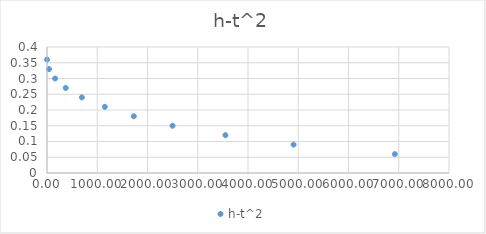
| Category | h-t^2 |
|---|---|
| 0.0 | 0.36 |
| 39.69 | 0.33 |
| 161.54410000000001 | 0.3 |
| 372.87609999999995 | 0.27 |
| 694.3225000000001 | 0.24 |
| 1151.2449 | 0.21 |
| 1728.0649 | 0.18 |
| 2498.0004 | 0.15 |
| 3550.9681000000005 | 0.12 |
| 4907.0025 | 0.09 |
| 6922.240000000001 | 0.06 |